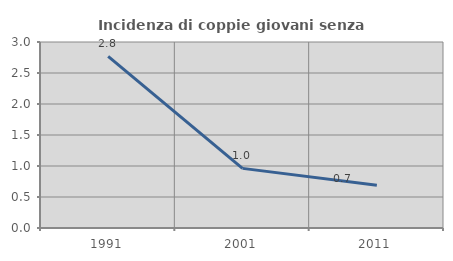
| Category | Incidenza di coppie giovani senza figli |
|---|---|
| 1991.0 | 2.768 |
| 2001.0 | 0.962 |
| 2011.0 | 0.69 |